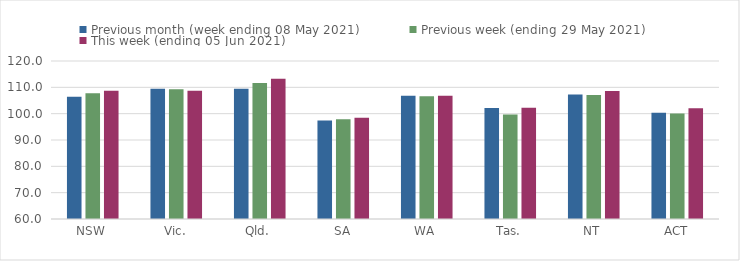
| Category | Previous month (week ending 08 May 2021) | Previous week (ending 29 May 2021) | This week (ending 05 Jun 2021) |
|---|---|---|---|
| NSW | 106.41 | 107.78 | 108.68 |
| Vic. | 109.44 | 109.25 | 108.73 |
| Qld. | 109.46 | 111.62 | 113.22 |
| SA | 97.43 | 97.88 | 98.46 |
| WA | 106.85 | 106.65 | 106.82 |
| Tas. | 102.14 | 99.71 | 102.27 |
| NT | 107.31 | 107.05 | 108.64 |
| ACT | 100.32 | 100.06 | 102.01 |